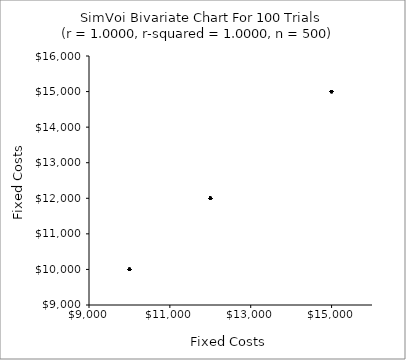
| Category | Series 0 |
|---|---|
| 12000.0 | 12000 |
| 12000.0 | 12000 |
| 12000.0 | 12000 |
| 10000.0 | 10000 |
| 12000.0 | 12000 |
| 15000.0 | 15000 |
| 10000.0 | 10000 |
| 10000.0 | 10000 |
| 10000.0 | 10000 |
| 12000.0 | 12000 |
| 12000.0 | 12000 |
| 12000.0 | 12000 |
| 12000.0 | 12000 |
| 15000.0 | 15000 |
| 12000.0 | 12000 |
| 15000.0 | 15000 |
| 10000.0 | 10000 |
| 12000.0 | 12000 |
| 12000.0 | 12000 |
| 15000.0 | 15000 |
| 12000.0 | 12000 |
| 10000.0 | 10000 |
| 10000.0 | 10000 |
| 12000.0 | 12000 |
| 15000.0 | 15000 |
| 12000.0 | 12000 |
| 12000.0 | 12000 |
| 12000.0 | 12000 |
| 12000.0 | 12000 |
| 12000.0 | 12000 |
| 10000.0 | 10000 |
| 12000.0 | 12000 |
| 10000.0 | 10000 |
| 15000.0 | 15000 |
| 15000.0 | 15000 |
| 10000.0 | 10000 |
| 12000.0 | 12000 |
| 12000.0 | 12000 |
| 12000.0 | 12000 |
| 12000.0 | 12000 |
| 15000.0 | 15000 |
| 12000.0 | 12000 |
| 15000.0 | 15000 |
| 12000.0 | 12000 |
| 12000.0 | 12000 |
| 12000.0 | 12000 |
| 10000.0 | 10000 |
| 12000.0 | 12000 |
| 10000.0 | 10000 |
| 12000.0 | 12000 |
| 10000.0 | 10000 |
| 15000.0 | 15000 |
| 12000.0 | 12000 |
| 12000.0 | 12000 |
| 15000.0 | 15000 |
| 10000.0 | 10000 |
| 12000.0 | 12000 |
| 12000.0 | 12000 |
| 12000.0 | 12000 |
| 10000.0 | 10000 |
| 15000.0 | 15000 |
| 10000.0 | 10000 |
| 15000.0 | 15000 |
| 10000.0 | 10000 |
| 12000.0 | 12000 |
| 15000.0 | 15000 |
| 12000.0 | 12000 |
| 15000.0 | 15000 |
| 10000.0 | 10000 |
| 15000.0 | 15000 |
| 10000.0 | 10000 |
| 10000.0 | 10000 |
| 10000.0 | 10000 |
| 10000.0 | 10000 |
| 12000.0 | 12000 |
| 10000.0 | 10000 |
| 12000.0 | 12000 |
| 10000.0 | 10000 |
| 12000.0 | 12000 |
| 12000.0 | 12000 |
| 15000.0 | 15000 |
| 10000.0 | 10000 |
| 12000.0 | 12000 |
| 10000.0 | 10000 |
| 15000.0 | 15000 |
| 12000.0 | 12000 |
| 12000.0 | 12000 |
| 12000.0 | 12000 |
| 12000.0 | 12000 |
| 10000.0 | 10000 |
| 10000.0 | 10000 |
| 12000.0 | 12000 |
| 10000.0 | 10000 |
| 12000.0 | 12000 |
| 15000.0 | 15000 |
| 12000.0 | 12000 |
| 10000.0 | 10000 |
| 12000.0 | 12000 |
| 12000.0 | 12000 |
| 10000.0 | 10000 |